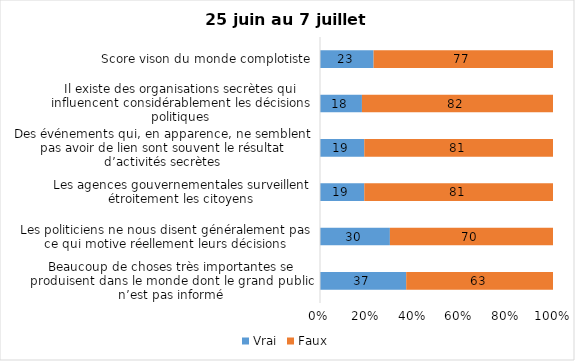
| Category | Vrai | Faux |
|---|---|---|
| Beaucoup de choses très importantes se produisent dans le monde dont le grand public n’est pas informé | 37 | 63 |
| Les politiciens ne nous disent généralement pas ce qui motive réellement leurs décisions | 30 | 70 |
| Les agences gouvernementales surveillent étroitement les citoyens | 19 | 81 |
| Des événements qui, en apparence, ne semblent pas avoir de lien sont souvent le résultat d’activités secrètes | 19 | 81 |
| Il existe des organisations secrètes qui influencent considérablement les décisions politiques | 18 | 82 |
| Score vison du monde complotiste | 23 | 77 |